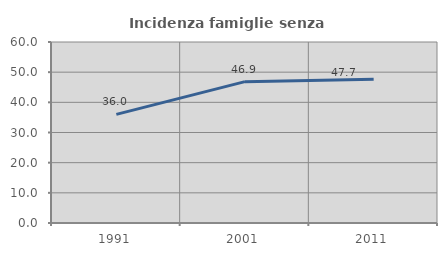
| Category | Incidenza famiglie senza nuclei |
|---|---|
| 1991.0 | 36.022 |
| 2001.0 | 46.857 |
| 2011.0 | 47.651 |